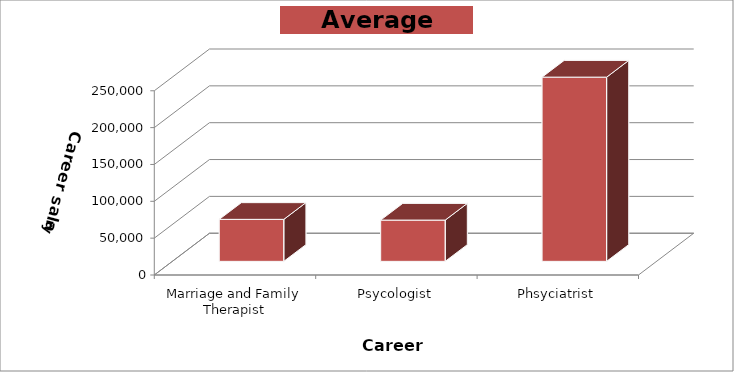
| Category | Series 0 |
|---|---|
| Marriage and Family Therapist | 57000 |
| Psycologist | 56000 |
| Phsyciatrist | 250000 |